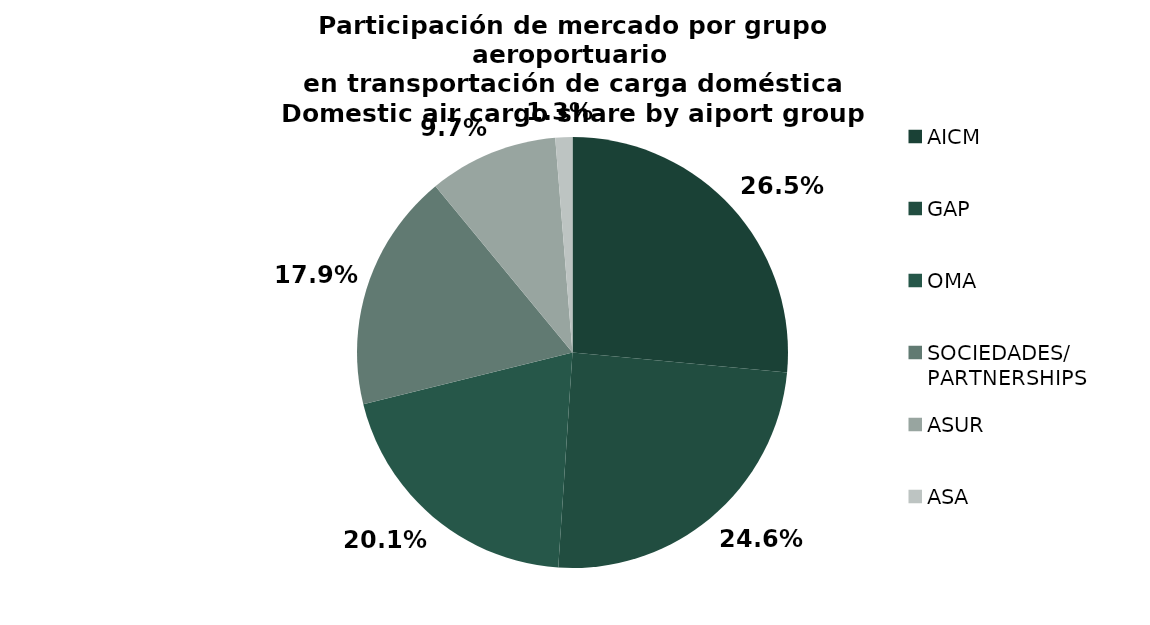
| Category | Series 0 |
|---|---|
| AICM | 9392.057 |
| GAP | 8712.752 |
| OMA | 7126.237 |
| SOCIEDADES/
PARTNERSHIPS | 6342.406 |
| ASUR | 3435.625 |
| ASA | 453.809 |